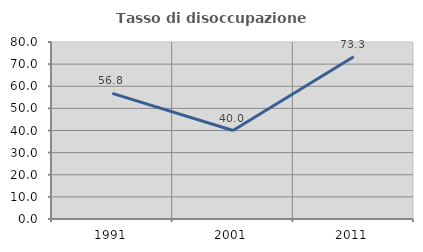
| Category | Tasso di disoccupazione giovanile  |
|---|---|
| 1991.0 | 56.757 |
| 2001.0 | 40 |
| 2011.0 | 73.333 |